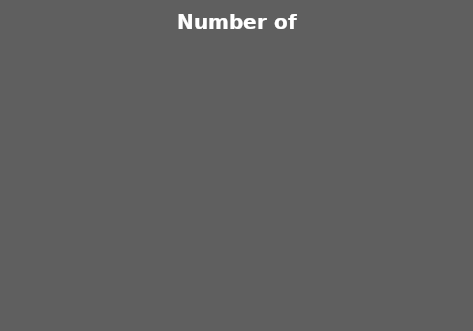
| Category | Series 0 |
|---|---|
| Abbot | 0 |
| Bass | 0 |
| Cavendar | 0 |
| Freesemann | 0 |
| Karpf | 0 |
| Morse | 0 |
| Turner | 0 |
| Walmsley | 0 |